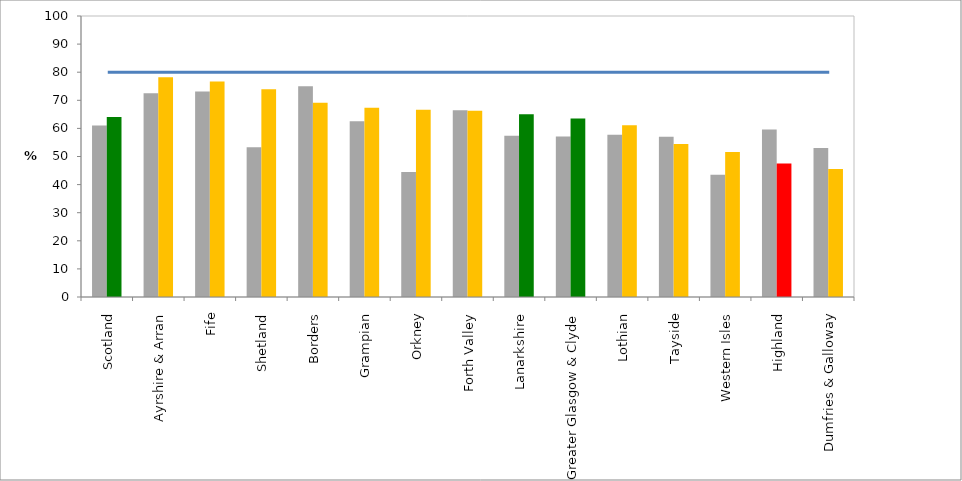
| Category | 2016 (%) | 2017 (%) |
|---|---|---|
| Scotland | 61.048 | 64.086 |
| Ayrshire & Arran | 72.496 | 78.185 |
| Fife | 73.146 | 76.681 |
| Shetland | 53.333 | 73.913 |
| Borders | 75 | 69.167 |
| Grampian | 62.582 | 67.34 |
| Orkney | 44.444 | 66.667 |
| Forth Valley | 66.418 | 66.259 |
| Lanarkshire | 57.363 | 65 |
| Greater Glasgow & Clyde | 57.119 | 63.486 |
| Lothian | 57.706 | 61.127 |
| Tayside | 57.013 | 54.426 |
| Western Isles | 43.478 | 51.613 |
| Highland | 59.61 | 47.522 |
| Dumfries & Galloway | 53.005 | 45.588 |